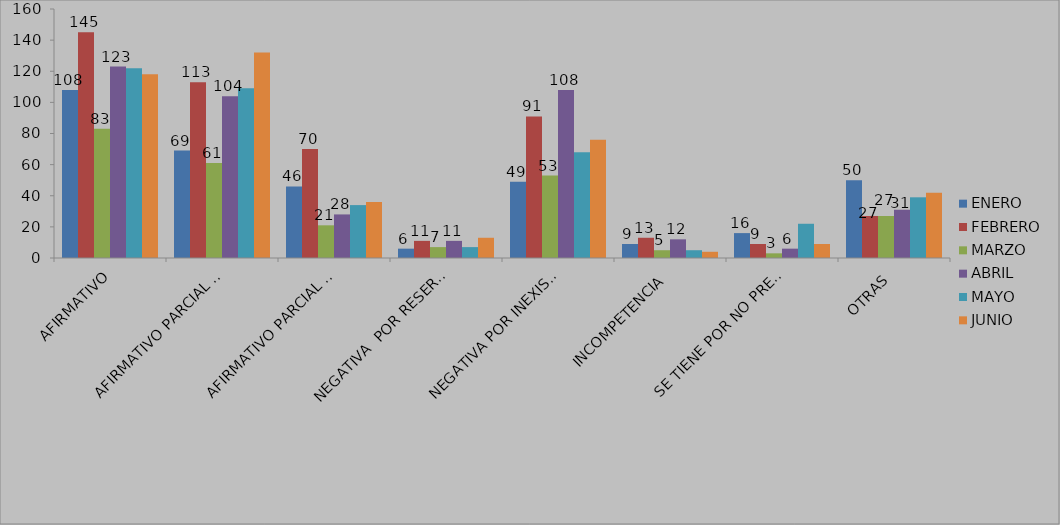
| Category | ENERO | FEBRERO | MARZO | ABRIL | MAYO | JUNIO |
|---|---|---|---|---|---|---|
| AFIRMATIVO | 108 | 145 | 83 | 123 | 122 | 118 |
| AFIRMATIVO PARCIAL POR CONFIDENCIALIDAD  | 69 | 113 | 61 | 104 | 109 | 132 |
| AFIRMATIVO PARCIAL POR INEXISTENCIA | 46 | 70 | 21 | 28 | 34 | 36 |
| NEGATIVA  POR RESERVA | 6 | 11 | 7 | 11 | 7 | 13 |
| NEGATIVA POR INEXISTENCIA | 49 | 91 | 53 | 108 | 68 | 76 |
| INCOMPETENCIA | 9 | 13 | 5 | 12 | 5 | 4 |
| SE TIENE POR NO PRESENTADA ( NO CUMPLIÓ PREVENCIÓN) | 16 | 9 | 3 | 6 | 22 | 9 |
| OTRAS | 50 | 27 | 27 | 31 | 39 | 42 |